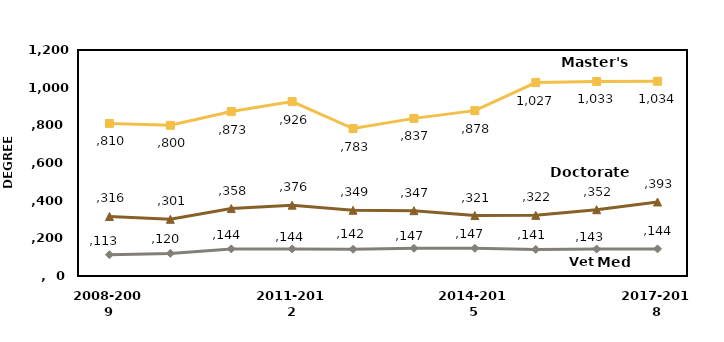
| Category | Vet Med | Master's | Doctorate |
|---|---|---|---|
| 2008-2009 | 113 | 810 | 316 |
| 2009-2010 | 120 | 800 | 301 |
| 2010-2011 | 144 | 873 | 358 |
| 2011-2012 | 144 | 926 | 376 |
| 2012-2013 | 142 | 783 | 349 |
| 2013-2014 | 147 | 837 | 347 |
| 2014-2015 | 147 | 878 | 321 |
| 2015-2016 | 141 | 1027 | 322 |
| 2016-2017 | 143 | 1033 | 352 |
| 2017-2018 | 144 | 1034 | 393 |